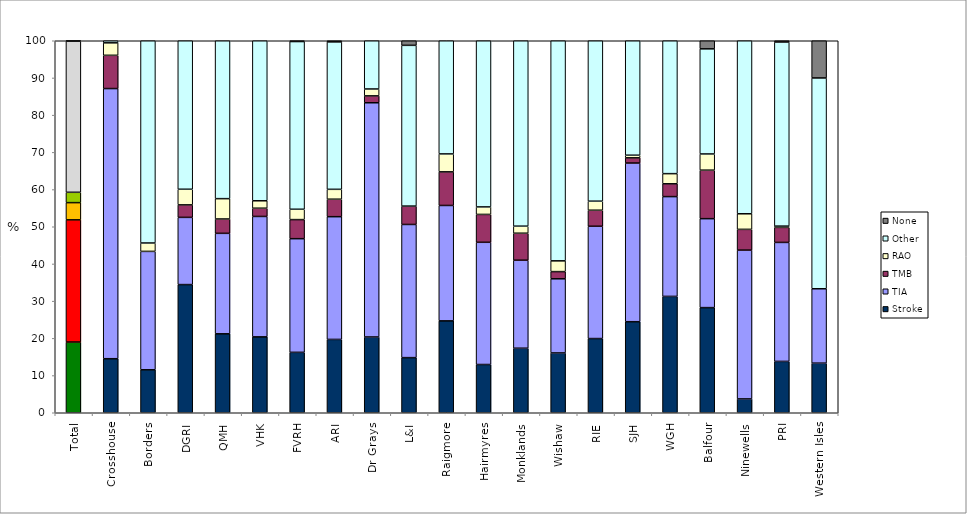
| Category | Stroke | TIA | TMB | RAO | Other | None |
|---|---|---|---|---|---|---|
| Total | 19.015 | 32.845 | 4.625 | 2.781 | 40.644 | 0.196 |
| Crosshouse | 14.525 | 72.626 | 8.939 | 3.352 | 0.559 | 0 |
| Borders | 11.549 | 31.831 | 0 | 2.254 | 54.648 | 0 |
| DGRI | 34.454 | 18.067 | 3.361 | 4.202 | 40.756 | 0 |
| QMH | 21.222 | 27.01 | 3.859 | 5.466 | 42.444 | 0 |
| VHK | 20.399 | 32.373 | 2.217 | 1.996 | 43.016 | 0 |
| FVRH | 16.239 | 30.556 | 5.128 | 2.778 | 45.085 | 0.427 |
| ARI | 19.714 | 32.993 | 4.699 | 2.656 | 39.632 | 0.511 |
| Dr Grays | 20.37 | 62.963 | 1.852 | 1.852 | 14.815 | 0 |
| L&I | 14.815 | 35.802 | 4.938 | 0 | 43.21 | 1.235 |
| Raigmore | 24.699 | 31.024 | 9.036 | 4.819 | 30.422 | 0 |
| Hairmyres | 12.968 | 32.853 | 7.493 | 2.017 | 44.669 | 0 |
| Monklands | 17.35 | 23.659 | 7.256 | 1.893 | 49.842 | 0 |
| Wishaw | 16.077 | 19.936 | 1.929 | 2.894 | 59.164 | 0 |
| RIE | 19.946 | 30.189 | 4.313 | 2.426 | 43.127 | 0 |
| SJH | 24.476 | 42.657 | 1.399 | 0.699 | 30.769 | 0 |
| WGH | 31.277 | 26.829 | 3.443 | 2.726 | 35.725 | 0 |
| Balfour | 28.261 | 23.913 | 13.043 | 4.348 | 28.261 | 2.174 |
| Ninewells | 3.721 | 40 | 5.581 | 4.186 | 46.512 | 0 |
| PRI | 13.805 | 31.987 | 4.04 | 0.337 | 49.495 | 0.337 |
| Western Isles | 13.333 | 20 | 0 | 0 | 56.667 | 10 |